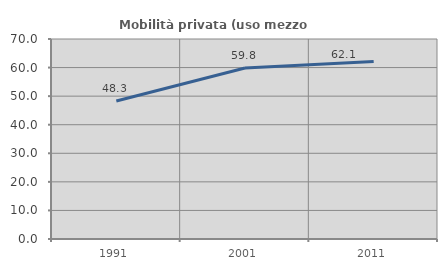
| Category | Mobilità privata (uso mezzo privato) |
|---|---|
| 1991.0 | 48.312 |
| 2001.0 | 59.841 |
| 2011.0 | 62.094 |